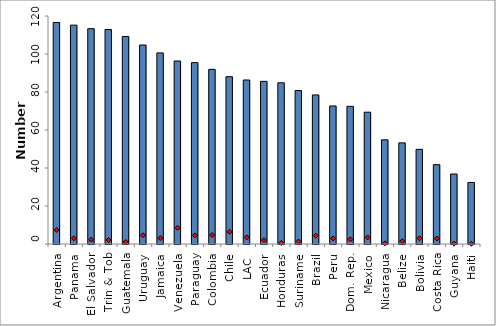
| Category | 2008 |
|---|---|
| Argentina | 116.61 |
| Panama | 115.19 |
| El Salvador | 113.32 |
| Trin & Tob | 112.87 |
| Guatemala | 109.22 |
| Uruguay | 104.73 |
| Jamaica | 100.58 |
| Venezuela | 96.31 |
| Paraguay | 95.46 |
| Colombia | 91.9 |
| Chile | 88.05 |
| LAC  | 86.316 |
| Ecuador | 85.61 |
| Honduras | 84.86 |
| Suriname | 80.76 |
| Brazil | 78.47 |
| Peru | 72.66 |
| Dom. Rep. | 72.45 |
| Mexico | 69.37 |
| Nicaragua | 54.84 |
| Belize | 53.23 |
| Bolivia | 49.82 |
| Costa Rica | 41.75 |
| Guyana | 36.84 |
| Haiti | 32.4 |